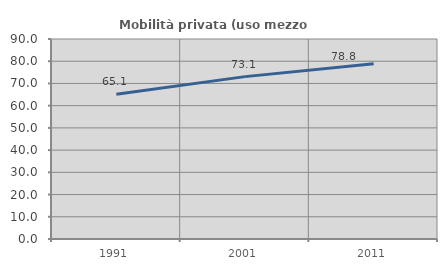
| Category | Mobilità privata (uso mezzo privato) |
|---|---|
| 1991.0 | 65.108 |
| 2001.0 | 73.072 |
| 2011.0 | 78.834 |